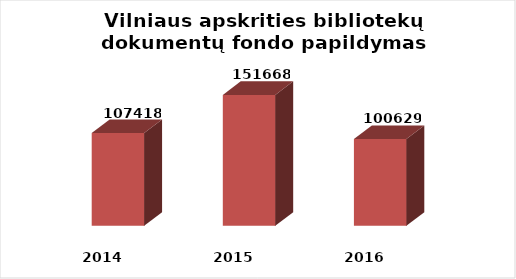
| Category | Series 0 |
|---|---|
| 2014.0 | 107418 |
| 2015.0 | 151668 |
| 2016.0 | 100629 |